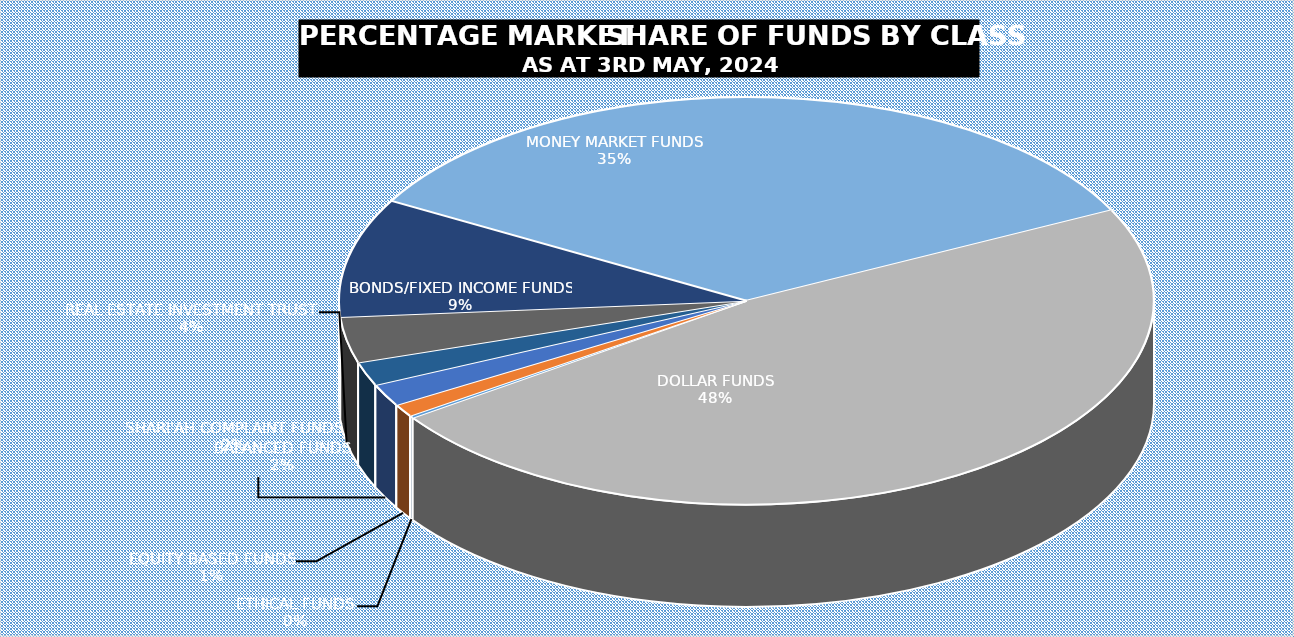
| Category | 3-May |
|---|---|
| ETHICAL FUNDS | 4807945930.62 |
| EQUITY BASED FUNDS | 27319052490.226 |
| BALANCED FUNDS | 48298812075.103 |
| SHARI'AH COMPLAINT FUNDS | 51539113968.288 |
| REAL ESTATE INVESTMENT TRUST | 99185326803.116 |
| BONDS/FIXED INCOME FUNDS | 257291528161.249 |
| MONEY MARKET FUNDS | 943173062252.889 |
| DOLLAR FUNDS | 1300480857237.764 |